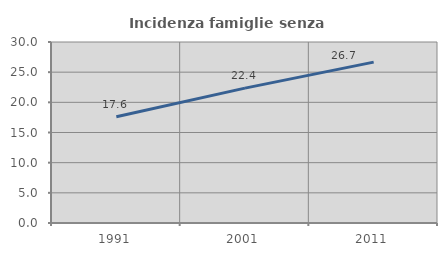
| Category | Incidenza famiglie senza nuclei |
|---|---|
| 1991.0 | 17.603 |
| 2001.0 | 22.35 |
| 2011.0 | 26.661 |